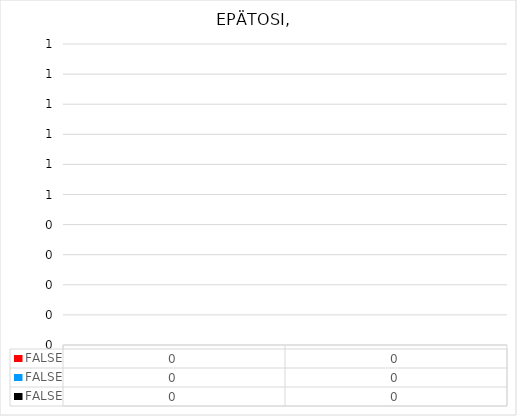
| Category | EPÄTOSI |
|---|---|
| 0 | 0 |
| 1 | 0 |